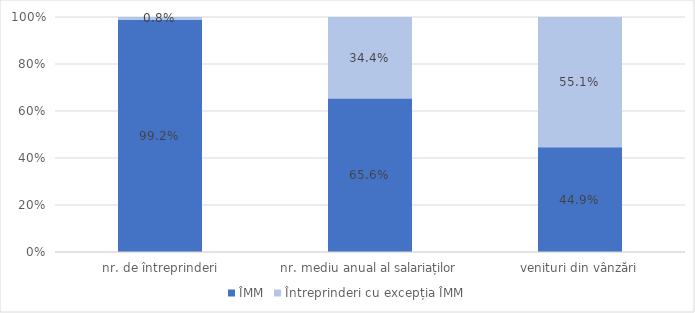
| Category | ÎMM | Întreprinderi cu excepția ÎMM |
|---|---|---|
| nr. de întreprinderi | 0.992 | 0.008 |
| nr. mediu anual al salariaților | 0.656 | 0.344 |
| venituri din vânzări | 0.449 | 0.551 |